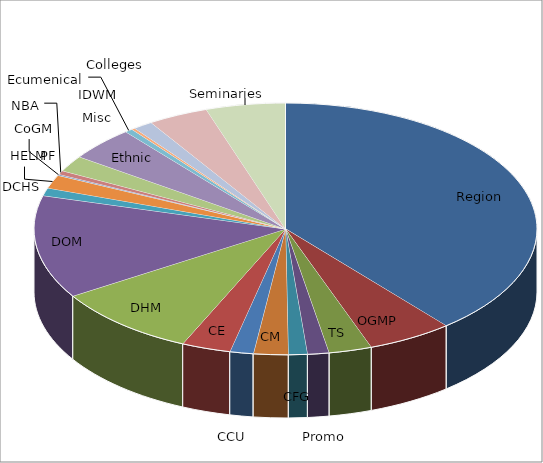
| Category | Series 0 |
|---|---|
| Region | 9487.819 |
| OGMP | 1335.577 |
| TS | 673.517 |
| Promo | 335.945 |
| CFG | 295.459 |
| CM | 539.282 |
| CCU | 366.999 |
| CE | 765.38 |
| DHM | 2273.588 |
| DOM | 3219.245 |
| DCHS | 246.781 |
| HELM | 418.583 |
| CoGM | 38.446 |
| NBA | 118.288 |
| PF | 503.264 |
| Ethnic | 1051.814 |
| Ecumenical | 122.33 |
| Misc | 54.898 |
| IDWM | 305.89 |
| Colleges | 944.049 |
| Seminaries | 1241.33 |